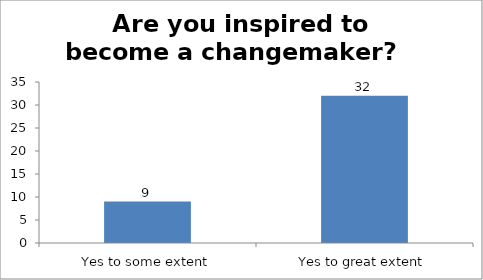
| Category | Are you inspired to become a changemaker?   |
|---|---|
| Yes to some extent | 9 |
| Yes to great extent | 32 |